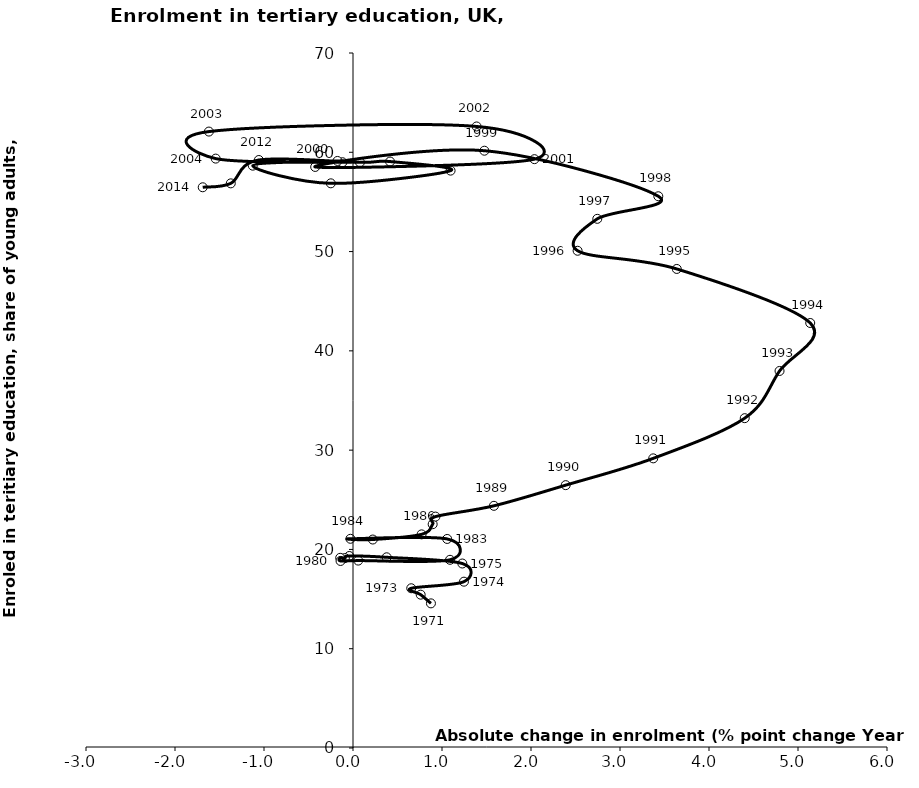
| Category | Series 0 |
|---|---|
| 0.8757200241088992 | 14.568 |
| 0.7602901458740501 | 15.444 |
| 0.6544203758240004 | 16.088 |
| 1.2466545104980504 | 16.752 |
| 1.2282590866088494 | 18.582 |
| 0.37826538085935013 | 19.209 |
| -0.04170989990229934 | 19.338 |
| -0.09138488769530007 | 19.126 |
| -0.1436500549316495 | 19.156 |
| -0.1399202346801509 | 18.838 |
| 0.05845546722409978 | 18.876 |
| 1.0899696350097496 | 18.955 |
| 1.058235168457049 | 21.056 |
| -0.028904914855949926 | 21.072 |
| 0.22258949279785156 | 20.998 |
| 0.7707052230835014 | 21.517 |
| 0.8951606750487997 | 22.539 |
| 0.926805496215799 | 23.307 |
| 1.5834045410156499 | 24.393 |
| 2.389889717102051 | 26.474 |
| 3.3734149932861506 | 29.173 |
| 4.401524543762198 | 33.221 |
| 4.792604446411097 | 37.976 |
| 5.137384414672852 | 42.806 |
| 3.6378955841064524 | 48.25 |
| 2.52359008789065 | 50.082 |
| 2.744850158691399 | 53.298 |
| 3.430419921875 | 55.571 |
| 1.4764556884766016 | 60.158 |
| -0.4248542785644496 | 58.524 |
| 2.03861427307125 | 59.309 |
| 1.3888149261474503 | 62.602 |
| -1.619064331054652 | 62.086 |
| -1.5426788330078018 | 59.363 |
| -0.11837577819824929 | 59.001 |
| -0.17449569702149859 | 59.127 |
| -1.1263408660888992 | 58.652 |
| -0.24929046630860086 | 56.874 |
| 1.0964756011962997 | 58.153 |
| 0.4162445068359517 | 59.067 |
| 0.07809066772459872 | 58.986 |
| -1.0578899383545028 | 59.223 |
| -1.3731861114501989 | 56.87 |
| -1.6884822845458949 | 56.477 |